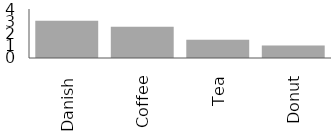
| Category | Item popularity |
|---|---|
| Danish | 3045 |
| Coffee | 2555 |
| Tea | 1500 |
| Donut | 1023 |